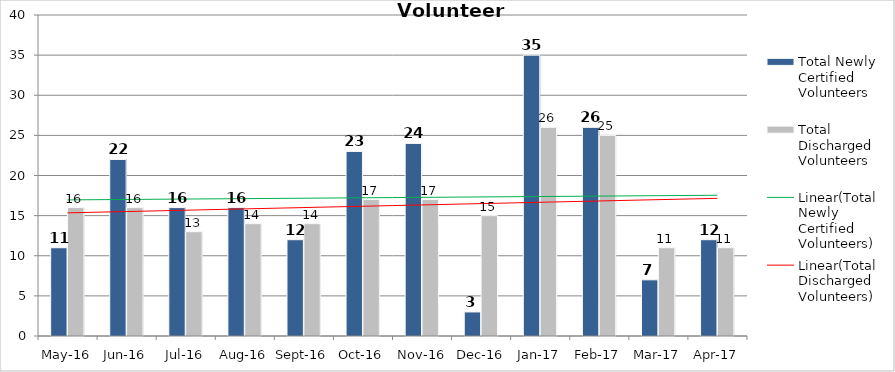
| Category | Total Newly Certified Volunteers | Total Discharged Volunteers |
|---|---|---|
| May-16 | 11 | 16 |
| Jun-16 | 22 | 16 |
| Jul-16 | 16 | 13 |
| Aug-16 | 16 | 14 |
| Sep-16 | 12 | 14 |
| Oct-16 | 23 | 17 |
| Nov-16 | 24 | 17 |
| Dec-16 | 3 | 15 |
| Jan-17 | 35 | 26 |
| Feb-17 | 26 | 25 |
| Mar-17 | 7 | 11 |
| Apr-17 | 12 | 11 |